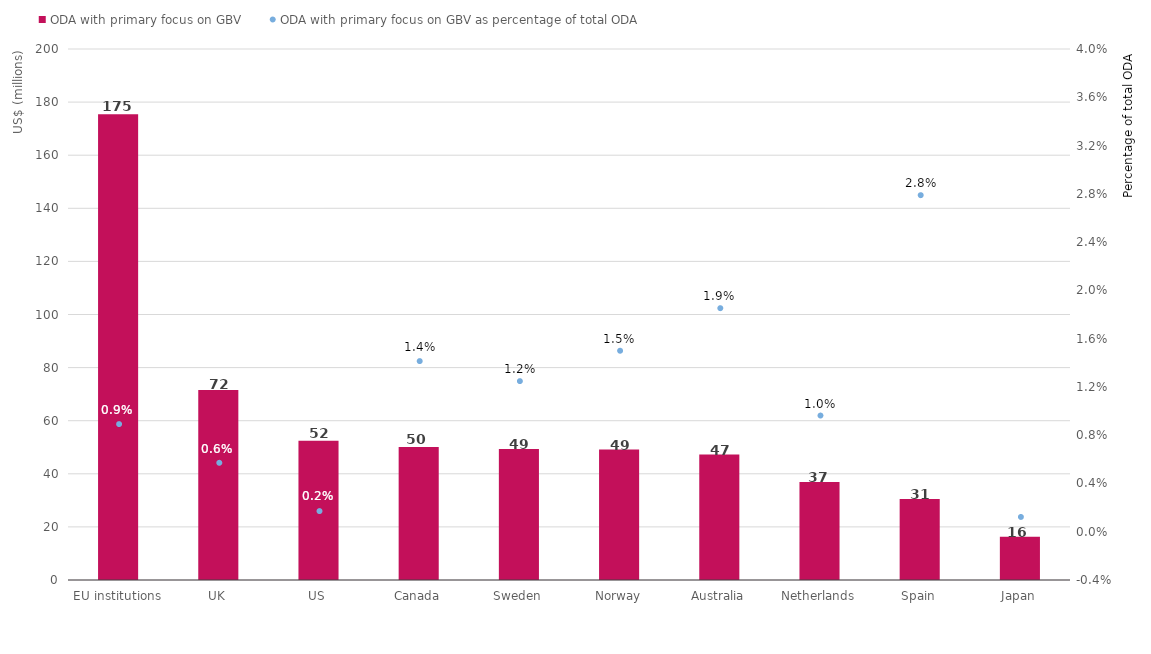
| Category | ODA with primary focus on GBV |
|---|---|
| EU institutions | 175.38 |
| UK | 71.529 |
| US | 52.433 |
| Canada | 50.083 |
| Sweden | 49.335 |
| Norway | 49.114 |
| Australia | 47.301 |
| Netherlands | 36.914 |
| Spain | 30.546 |
| Japan | 16.284 |